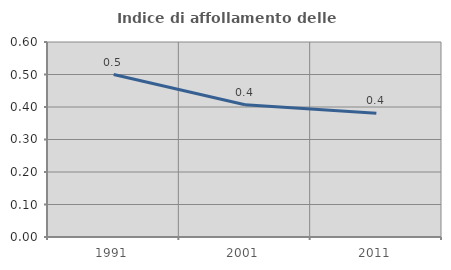
| Category | Indice di affollamento delle abitazioni  |
|---|---|
| 1991.0 | 0.5 |
| 2001.0 | 0.407 |
| 2011.0 | 0.38 |